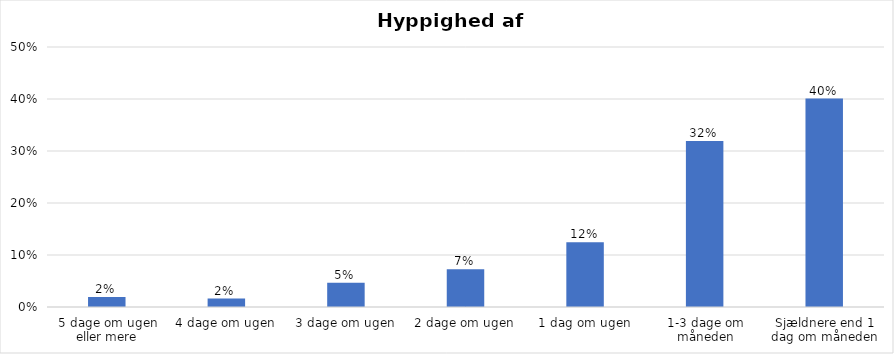
| Category | % |
|---|---|
| 5 dage om ugen eller mere | 0.019 |
| 4 dage om ugen | 0.016 |
| 3 dage om ugen | 0.047 |
| 2 dage om ugen | 0.073 |
| 1 dag om ugen | 0.125 |
| 1-3 dage om måneden | 0.319 |
| Sjældnere end 1 dag om måneden | 0.401 |